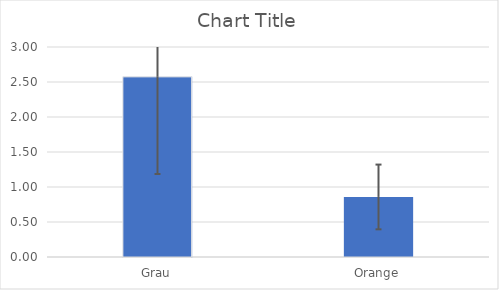
| Category | Series 0 |
|---|---|
| Grau | 2.573 |
| Orange | 0.858 |